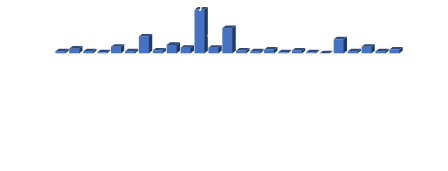
| Category | Total |
|---|---|
| Баацагаан сум | 2 |
| Баянбулаг сум | 5 |
| Баянговь сум | 2 |
| Баянлиг сум | 1 |
| Баян-Овоо сум | 7 |
| Баян-Өндөр сум | 2 |
| Баянхонгор аймгийн Засаг дарга | 18 |
| Баянхонгор сум | 3 |
| Баянцагаан сум | 9 |
| Богд сум | 6 |
| Боловсролын салбар | 47 |
| Бөмбөгөр сум | 6 |
| Бусад ТЕЗ-ийн харьяа | 27 |
| Бууцагаан сум | 3 |
| Галуут сум | 2 |
| Гурванбулаг сум | 4 |
| Жаргалант сум | 1 |
| Жинст сум | 3 |
| Заг сум | 1 |
| Өлзийт сум | 0 |
| Соёлын салбар | 15 |
| Хүрээмарал сум | 2 |
| Шинэжинст сум | 7 |
| Эрдэнэцогт сум | 2 |
| Эрүүл мэндийн салбар | 4 |